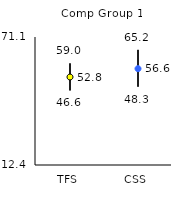
| Category | 25th | 75th | Mean |
|---|---|---|---|
| TFS | 46.6 | 59 | 52.75 |
| CSS | 48.3 | 65.2 | 56.58 |